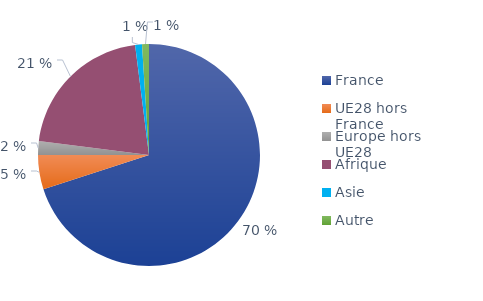
| Category | Series 0 |
|---|---|
| France | 0.7 |
| UE28 hors France | 0.05 |
| Europe hors UE28 | 0.02 |
| Afrique | 0.21 |
| Asie | 0.01 |
| Autre | 0.01 |